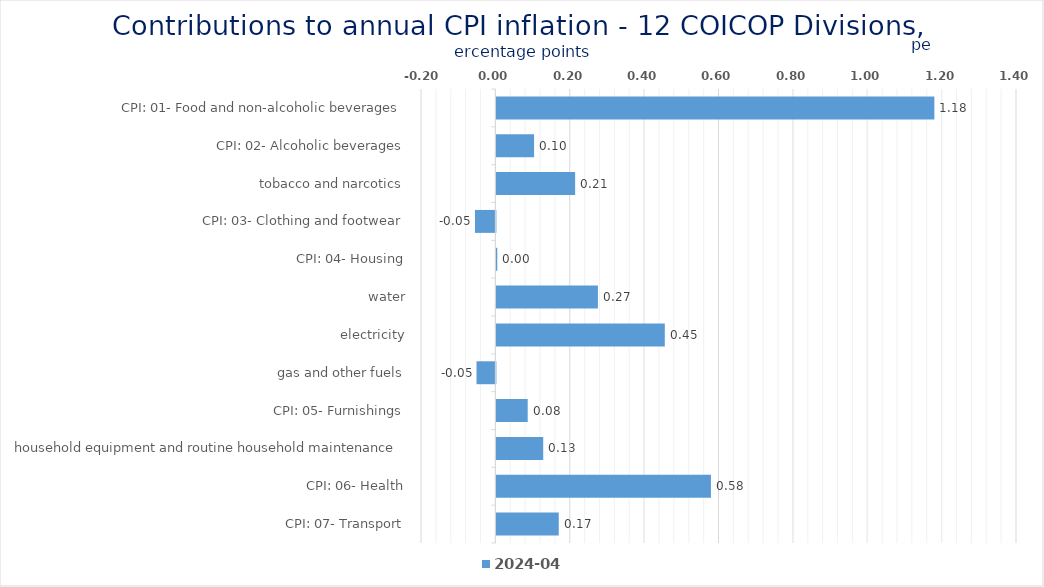
| Category | 2024-04 |
|---|---|
| CPI: 01- Food and non-alcoholic beverages | 1.178 |
| CPI: 02- Alcoholic beverages, tobacco and narcotics | 0.101 |
| CPI: 03- Clothing and footwear | 0.212 |
| CPI: 04- Housing, water, electricity, gas and other fuels | -0.055 |
| CPI: 05- Furnishings, household equipment and routine household maintenance | 0.002 |
| CPI: 06- Health | 0.273 |
| CPI: 07- Transport | 0.453 |
| CPI: 08- Communication | -0.051 |
| CPI: 09- Recreation and culture | 0.084 |
| CPI: 10- Education | 0.126 |
| CPI: 11- Restaurants and hotels | 0.577 |
| CPI: 12- Miscellaneous goods and services | 0.168 |